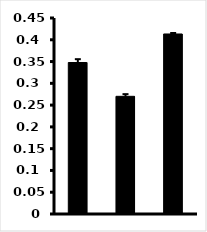
| Category | Series 0 |
|---|---|
| 0 | 0.348 |
| 1 | 0.27 |
| 2 | 0.413 |